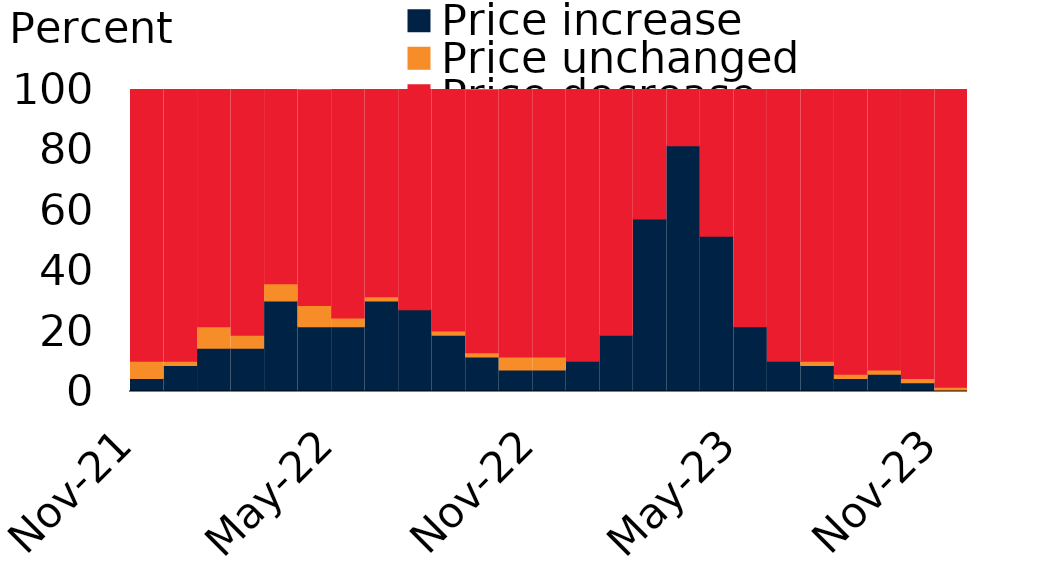
| Category | Price increase | Price unchanged | Price decrease |
|---|---|---|---|
| 2021-11-30 | 4.3 | 5.7 | 90 |
| 2021-12-31 | 8.6 | 1.4 | 90 |
| 2022-01-31 | 14.3 | 7.1 | 78.6 |
| 2022-02-28 | 14.3 | 4.3 | 81.4 |
| 2022-03-31 | 30 | 5.7 | 64.3 |
| 2022-04-30 | 21.4 | 7.1 | 71.4 |
| 2022-05-31 | 21.4 | 2.9 | 75.7 |
| 2022-06-30 | 30 | 1.4 | 68.6 |
| 2022-07-31 | 27.1 | 0 | 72.9 |
| 2022-08-31 | 18.6 | 1.4 | 80 |
| 2022-09-30 | 11.4 | 1.4 | 87.1 |
| 2022-10-31 | 7.1 | 4.3 | 88.6 |
| 2022-11-30 | 7.1 | 4.3 | 88.6 |
| 2022-12-31 | 10 | 0 | 90 |
| 2023-01-31 | 18.6 | 0 | 81.4 |
| 2023-02-28 | 57.1 | 0 | 42.9 |
| 2023-03-31 | 81.4 | 0 | 18.6 |
| 2023-04-30 | 51.4 | 0 | 48.6 |
| 2023-05-31 | 21.4 | 0 | 78.6 |
| 2023-06-30 | 10 | 0 | 90 |
| 2023-07-31 | 8.6 | 1.4 | 90 |
| 2023-08-31 | 4.3 | 1.4 | 94.3 |
| 2023-09-30 | 5.7 | 1.4 | 92.9 |
| 2023-10-31 | 2.9 | 1.4 | 95.7 |
| 2023-11-30 | 0 | 1.4 | 98.6 |